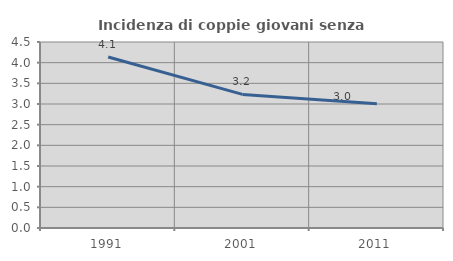
| Category | Incidenza di coppie giovani senza figli |
|---|---|
| 1991.0 | 4.138 |
| 2001.0 | 3.232 |
| 2011.0 | 3.004 |